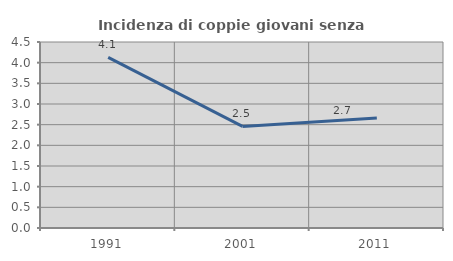
| Category | Incidenza di coppie giovani senza figli |
|---|---|
| 1991.0 | 4.13 |
| 2001.0 | 2.457 |
| 2011.0 | 2.663 |